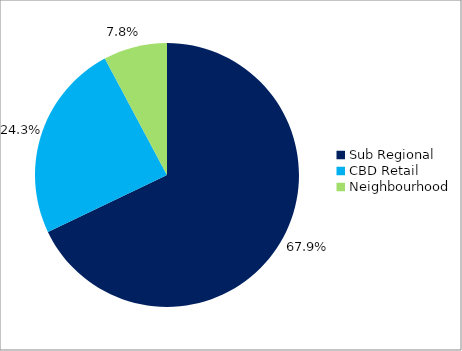
| Category | Series 0 |
|---|---|
| Sub Regional | 0.679 |
| CBD Retail | 0.243 |
| Neighbourhood | 0.078 |